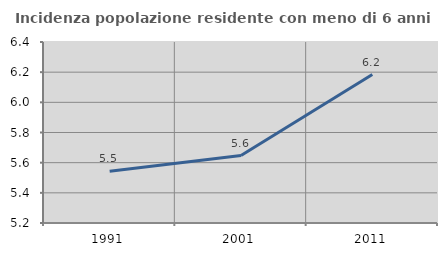
| Category | Incidenza popolazione residente con meno di 6 anni |
|---|---|
| 1991.0 | 5.544 |
| 2001.0 | 5.647 |
| 2011.0 | 6.184 |